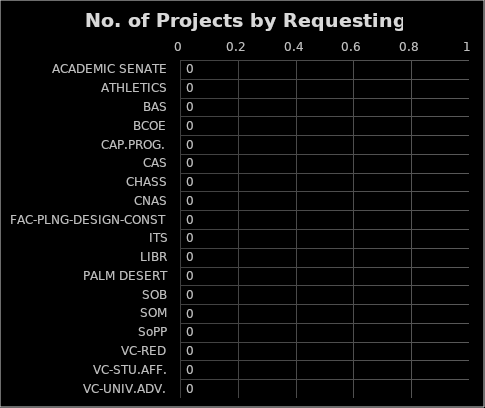
| Category | Series 0 |
|---|---|
| ACADEMIC SENATE | 0 |
| ATHLETICS | 0 |
| BAS | 0 |
| BCOE | 0 |
| CAP.PROG. | 0 |
| CAS | 0 |
| CHASS | 0 |
| CNAS | 0 |
| FAC-PLNG-DESIGN-CONST | 0 |
| ITS | 0 |
| LIBR | 0 |
| PALM DESERT | 0 |
| SOB | 0 |
| SOM | 0 |
| SoPP | 0 |
| VC-RED | 0 |
| VC-STU.AFF. | 0 |
| VC-UNIV.ADV. | 0 |